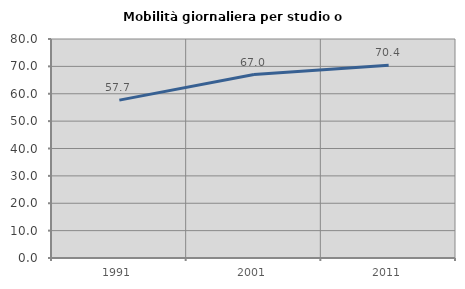
| Category | Mobilità giornaliera per studio o lavoro |
|---|---|
| 1991.0 | 57.669 |
| 2001.0 | 67.008 |
| 2011.0 | 70.383 |